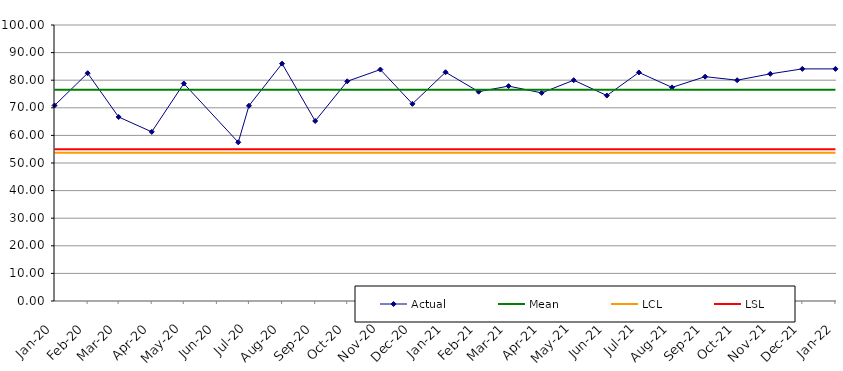
| Category | Actual | Mean | LCL | LSL |
|---|---|---|---|---|
| 2020-01-01 | 70.84 | 76.515 | 53.697 | 55 |
| 2020-02-01 | 82.54 | 76.515 | 53.697 | 55 |
| 2020-03-01 | 66.67 | 76.515 | 53.697 | 55 |
| 2020-04-01 | 61.29 | 76.515 | 53.697 | 55 |
| 2020-05-01 | 78.79 | 76.515 | 53.697 | 55 |
| 2020-06-21 | 57.5 | 76.515 | 53.697 | 55 |
| 2020-07-01 | 70.74 | 76.515 | 53.697 | 55 |
| 2020-08-01 | 86 | 76.515 | 53.697 | 55 |
| 2020-09-01 | 65.22 | 76.515 | 53.697 | 55 |
| 2020-10-01 | 79.6 | 76.515 | 53.697 | 55 |
| 2020-11-01 | 83.85 | 76.515 | 53.697 | 55 |
| 2020-12-01 | 71.43 | 76.515 | 53.697 | 55 |
| 2021-01-01 | 82.89 | 76.515 | 53.697 | 55 |
| 2021-02-01 | 75.84 | 76.515 | 53.697 | 55 |
| 2021-03-01 | 77.86 | 76.515 | 53.697 | 55 |
| 2021-04-01 | 75.4 | 76.515 | 53.697 | 55 |
| 2021-05-01 | 80 | 76.515 | 53.697 | 55 |
| 2021-06-01 | 74.44 | 76.515 | 53.697 | 55 |
| 2021-07-01 | 82.81 | 76.515 | 53.697 | 55 |
| 2021-08-01 | 77.39 | 76.515 | 53.697 | 55 |
| 2021-09-01 | 81.28 | 76.515 | 53.697 | 55 |
| 2021-10-01 | 80 | 76.515 | 53.697 | 55 |
| 2021-11-01 | 82.3 | 76.515 | 53.697 | 55 |
| 2021-12-01 | 84.1 | 76.515 | 53.697 | 55 |
| 2022-01-01 | 84.1 | 76.515 | 53.697 | 55 |